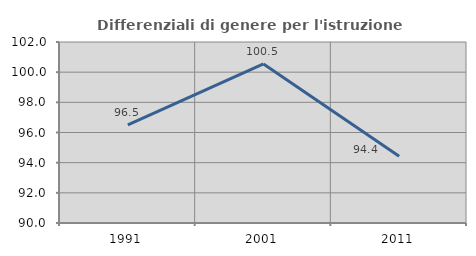
| Category | Differenziali di genere per l'istruzione superiore |
|---|---|
| 1991.0 | 96.505 |
| 2001.0 | 100.548 |
| 2011.0 | 94.42 |